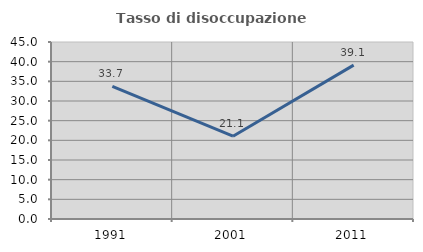
| Category | Tasso di disoccupazione giovanile  |
|---|---|
| 1991.0 | 33.735 |
| 2001.0 | 21.053 |
| 2011.0 | 39.13 |